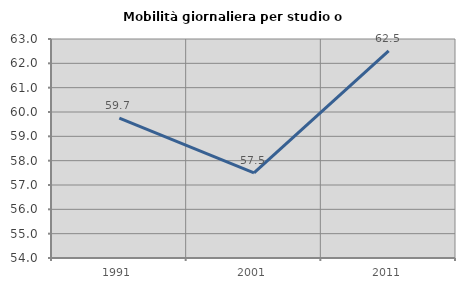
| Category | Mobilità giornaliera per studio o lavoro |
|---|---|
| 1991.0 | 59.744 |
| 2001.0 | 57.499 |
| 2011.0 | 62.509 |